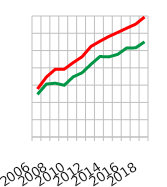
| Category | Schweiz | Kanton SG |
|---|---|---|
| 2006.0 | 103.884 | 102.341 |
| 2007.0 | 107.346 | 105.304 |
| 2008.0 | 109.6 | 105.563 |
| 2009.0 | 109.619 | 104.964 |
| 2010.0 | 111.504 | 107.389 |
| 2011.0 | 113.201 | 108.576 |
| 2012.0 | 116.197 | 111.037 |
| 2013.0 | 117.697 | 113.275 |
| 2014.0 | 119.07 | 113.171 |
| 2015.0 | 120.246 | 113.913 |
| 2016.0 | 121.471 | 115.753 |
| 2017.0 | 122.632 | 115.786 |
| 2018.0 | 124.711 | 117.518 |